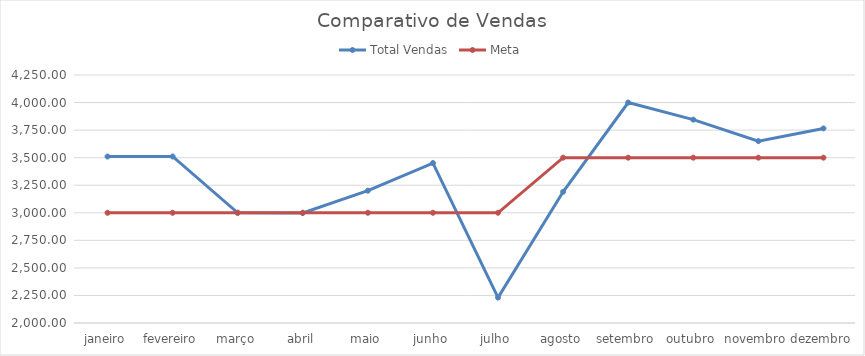
| Category | Total Vendas | Meta |
|---|---|---|
| janeiro | 3510.4 | 3000 |
| fevereiro | 3510.7 | 3000 |
| março | 3000 | 3000 |
| abril | 2998.55 | 3000 |
| maio | 3200.65 | 3000 |
| junho | 3450.99 | 3000 |
| julho | 2230.99 | 3000 |
| agosto | 3190.45 | 3500 |
| setembro | 4000.05 | 3500 |
| outubro | 3845 | 3500 |
| novembro | 3650 | 3500 |
| dezembro | 3765.4 | 3500 |